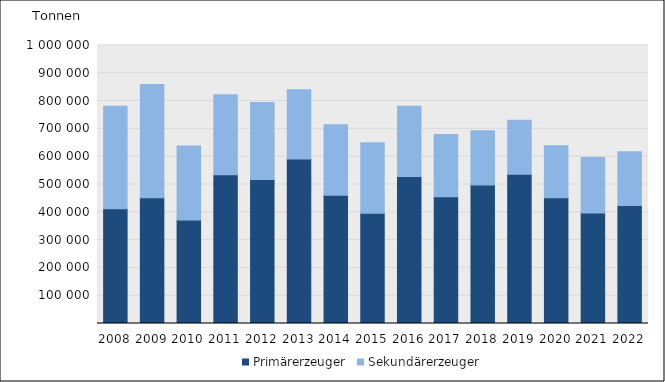
| Category | Primärerzeuger | Sekundärerzeuger |
|---|---|---|
| 2008.0 | 412719 | 368718 |
| 2009.0 | 452024 | 407812 |
| 2010.0 | 371926 | 266534 |
| 2011.0 | 535192 | 287739 |
| 2012.0 | 518083 | 276594 |
| 2013.0 | 591315 | 249291 |
| 2014.0 | 461117 | 253893 |
| 2015.0 | 396331 | 253506 |
| 2016.0 | 528687 | 252656 |
| 2017.0 | 455741 | 223764 |
| 2018.0 | 497812 | 195188 |
| 2019.0 | 536439 | 195089 |
| 2020.0 | 452540 | 187296 |
| 2021.0 | 397815 | 199555 |
| 2022.0 | 424185 | 193725 |